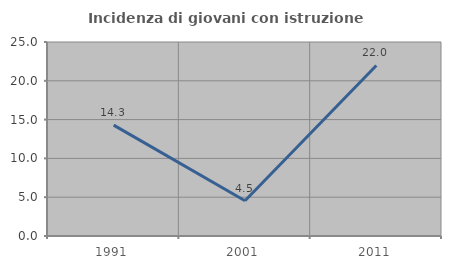
| Category | Incidenza di giovani con istruzione universitaria |
|---|---|
| 1991.0 | 14.286 |
| 2001.0 | 4.545 |
| 2011.0 | 21.978 |